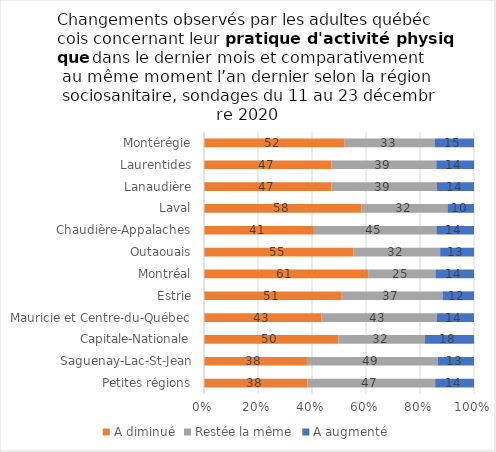
| Category | A diminué | Restée la même | A augmenté |
|---|---|---|---|
| Petites régions | 38.308 | 47.305 | 14.387 |
| Saguenay-Lac-St-Jean | 38.138 | 48.53 | 13.332 |
| Capitale-Nationale | 49.736 | 32.115 | 18.149 |
| Mauricie et Centre-du-Québec | 43.447 | 42.791 | 13.762 |
| Estrie | 51.024 | 37.324 | 11.653 |
| Montréal | 60.793 | 24.934 | 14.273 |
| Outaouais | 55.404 | 32.065 | 12.53 |
| Chaudière-Appalaches | 40.7 | 45.392 | 13.908 |
| Laval | 58.369 | 31.8 | 9.831 |
| Lanaudière | 47.173 | 39.128 | 13.699 |
| Laurentides | 47.213 | 38.83 | 13.957 |
| Montérégie | 52.105 | 33.262 | 14.633 |